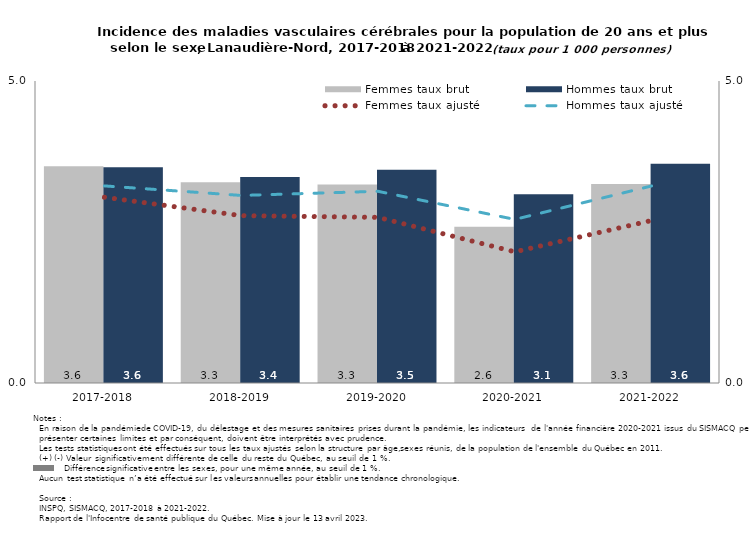
| Category | Femmes taux brut | Hommes taux brut |
|---|---|---|
| 2017-2018 | 3.59 | 3.573 |
| 2018-2019 | 3.325 | 3.411 |
| 2019-2020 | 3.286 | 3.529 |
| 2020-2021 | 2.587 | 3.125 |
| 2021-2022 | 3.296 | 3.63 |